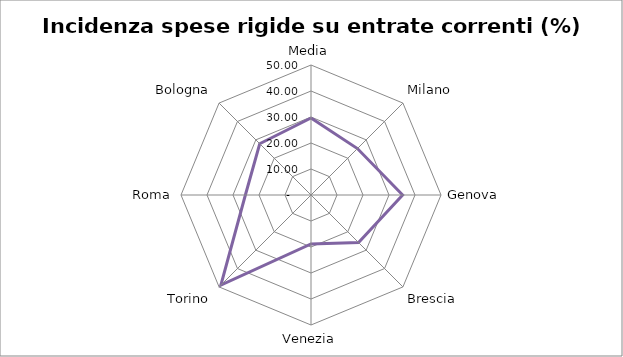
| Category | Incidenza spese rigide su entrate correnti |
|---|---|
| Media | 29.62 |
| Milano | 25.25 |
| Genova | 35.24 |
| Brescia | 25.88 |
| Venezia | 18.82 |
| Torino | 49.02 |
| Roma | 25.24 |
| Bologna | 27.89 |